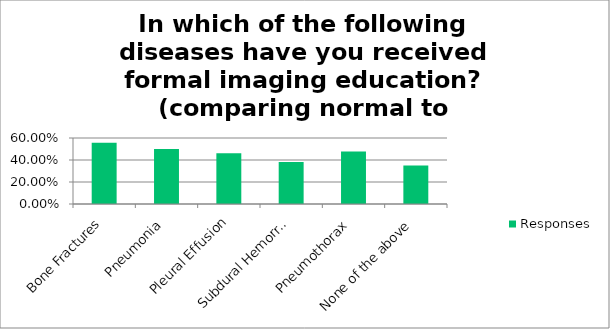
| Category | Responses |
|---|---|
| Bone Fractures | 0.556 |
| Pneumonia | 0.501 |
| Pleural Effusion | 0.46 |
| Subdural Hemorrhage | 0.382 |
| Pneumothorax | 0.478 |
| None of the above | 0.35 |